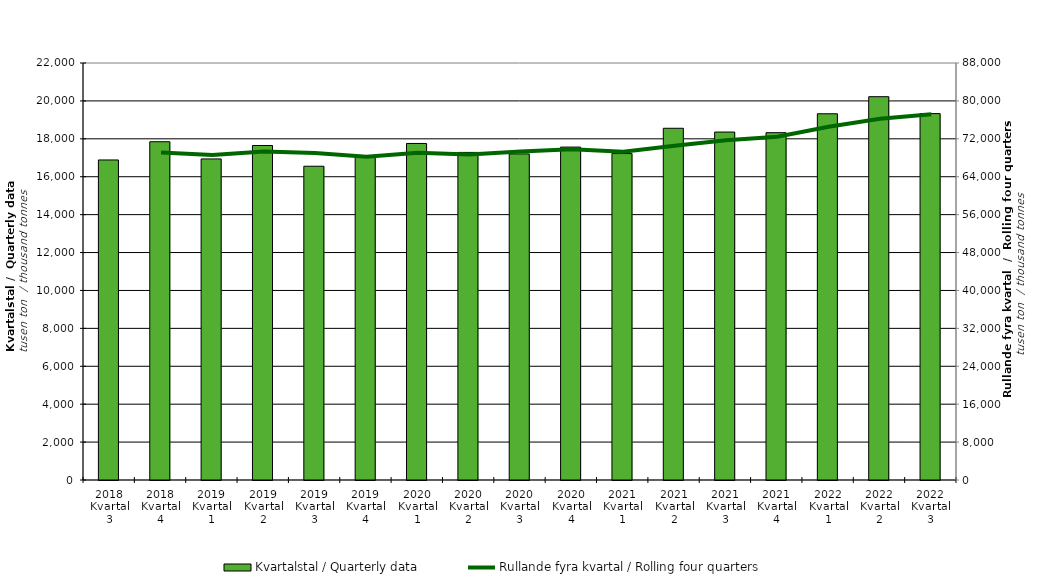
| Category | Kvartalstal / Quarterly data |
|---|---|
| 2018 Kvartal 3 | 16884.53 |
| 2018 Kvartal 4 | 17846.541 |
| 2019 Kvartal 1 | 16938.711 |
| 2019 Kvartal 2 | 17647.493 |
| 2019 Kvartal 3 | 16553.159 |
| 2019 Kvartal 4 | 17080.691 |
| 2020 Kvartal 1 | 17755.324 |
| 2020 Kvartal 2 | 17283.081 |
| 2020 Kvartal 3 | 17203.185 |
| 2020 Kvartal 4 | 17563.403 |
| 2021 Kvartal 1 | 17221.505 |
| 2021 Kvartal 2 | 18556.292 |
| 2021 Kvartal 3 | 18357.009 |
| 2021 Kvartal 4 | 18323.49 |
| 2022 Kvartal 1 | 19321.639 |
| 2022 Kvartal 2 | 20222.595 |
| 2022 Kvartal 3 | 19330.293 |